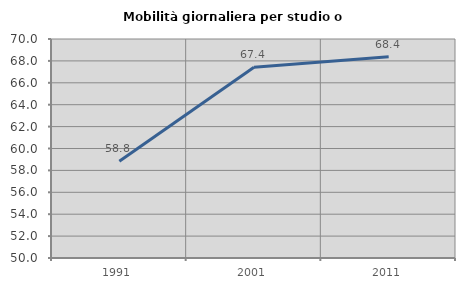
| Category | Mobilità giornaliera per studio o lavoro |
|---|---|
| 1991.0 | 58.84 |
| 2001.0 | 67.421 |
| 2011.0 | 68.384 |